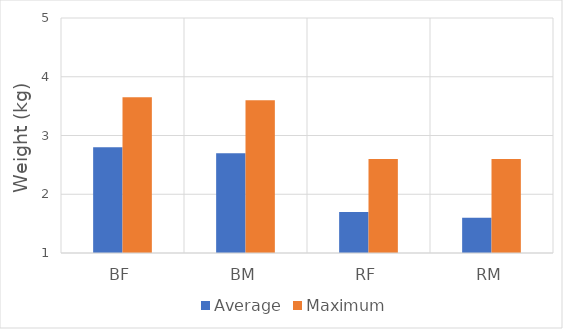
| Category | Average | Maximum |
|---|---|---|
| BF | 2.8 | 3.65 |
| BM | 2.7 | 3.6 |
| RF | 1.7 | 2.6 |
| RM | 1.6 | 2.6 |